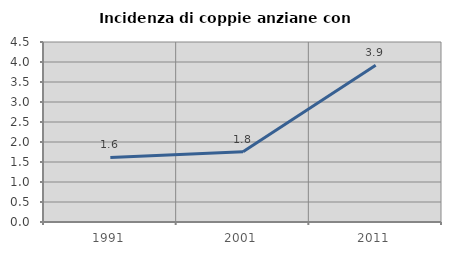
| Category | Incidenza di coppie anziane con figli |
|---|---|
| 1991.0 | 1.613 |
| 2001.0 | 1.754 |
| 2011.0 | 3.922 |